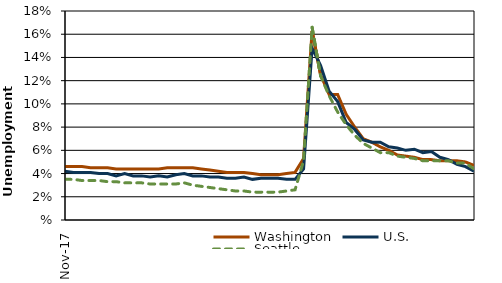
| Category | Washington | U.S. | Seattle |
|---|---|---|---|
| 2017-11-01 | 4.6 | 4.2 | 3.5 |
| 2017-12-01 | 4.6 | 4.1 | 3.5 |
| 2018-01-01 | 4.6 | 4.1 | 3.4 |
| 2018-02-01 | 4.5 | 4.1 | 3.4 |
| 2018-03-01 | 4.5 | 4 | 3.4 |
| 2018-04-01 | 4.5 | 4 | 3.3 |
| 2018-05-01 | 4.4 | 3.8 | 3.3 |
| 2018-06-01 | 4.4 | 4 | 3.2 |
| 2018-07-01 | 4.4 | 3.8 | 3.2 |
| 2018-08-01 | 4.4 | 3.8 | 3.2 |
| 2018-09-01 | 4.4 | 3.7 | 3.1 |
| 2018-10-01 | 4.4 | 3.8 | 3.1 |
| 2018-11-01 | 4.5 | 3.7 | 3.1 |
| 2018-12-01 | 4.5 | 3.9 | 3.1 |
| 2019-01-01 | 4.5 | 4 | 3.2 |
| 2019-02-01 | 4.5 | 3.8 | 3 |
| 2019-03-01 | 4.4 | 3.8 | 2.9 |
| 2019-04-01 | 4.3 | 3.7 | 2.8 |
| 2019-05-01 | 4.2 | 3.7 | 2.7 |
| 2019-06-01 | 4.1 | 3.6 | 2.6 |
| 2019-07-01 | 4.1 | 3.6 | 2.5 |
| 2019-08-01 | 4.1 | 3.7 | 2.5 |
| 2019-09-01 | 4 | 3.5 | 2.4 |
| 2019-10-01 | 3.9 | 3.6 | 2.4 |
| 2019-11-01 | 3.9 | 3.6 | 2.4 |
| 2019-12-01 | 3.9 | 3.6 | 2.4 |
| 2020-01-01 | 4 | 3.5 | 2.5 |
| 2020-02-01 | 4.1 | 3.5 | 2.6 |
| 2020-03-01 | 5.3 | 4.4 | 5.1 |
| 2020-04-01 | 16.3 | 14.8 | 16.6 |
| 2020-05-01 | 12.5 | 13.3 | 12.4 |
| 2020-06-01 | 10.8 | 11.1 | 10.7 |
| 2020-07-01 | 10.8 | 10.2 | 9.3 |
| 2020-08-01 | 9.1 | 8.4 | 8.2 |
| 2020-09-01 | 8 | 7.8 | 7.3 |
| 2020-10-01 | 7 | 6.9 | 6.6 |
| 2020-11-01 | 6.7 | 6.7 | 6.2 |
| 2020-12-01 | 6.3 | 6.7 | 5.8 |
| 2021-01-01 | 6 | 6.3 | 5.8 |
| 2021-02-01 | 5.6 | 6.2 | 5.5 |
| 2021-03-01 | 5.5 | 6 | 5.4 |
| 2021-04-01 | 5.4 | 6.1 | 5.3 |
| 2021-05-01 | 5.2 | 5.8 | 5.1 |
| 2021-06-01 | 5.2 | 5.9 | 5.1 |
| 2021-07-01 | 5.1 | 5.4 | 5.1 |
| 2021-08-01 | 5.1 | 5.2 | 5.1 |
| 2021-09-01 | 5.1 | 4.8 | 4.9 |
| 2021-10-01 | 5 | 4.6 | 4.9 |
| 2021-11-01 | 4.7 | 4.2 | 4.4 |